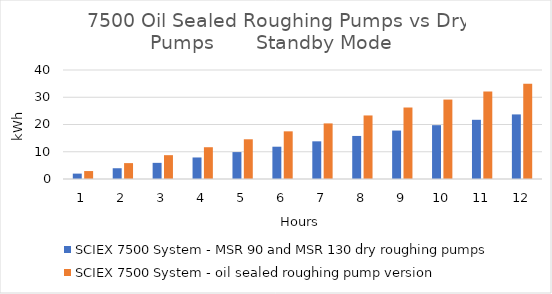
| Category | SCIEX 7500 System - MSR 90 and MSR 130 dry roughing pumps  | SCIEX 7500 System - oil sealed roughing pump version  |
|---|---|---|
| 0 | 1.975 | 2.915 |
| 1 | 3.95 | 5.83 |
| 2 | 5.925 | 8.745 |
| 3 | 7.9 | 11.66 |
| 4 | 9.875 | 14.575 |
| 5 | 11.85 | 17.49 |
| 6 | 13.825 | 20.405 |
| 7 | 15.8 | 23.32 |
| 8 | 17.775 | 26.235 |
| 9 | 19.75 | 29.15 |
| 10 | 21.725 | 32.065 |
| 11 | 23.7 | 34.98 |